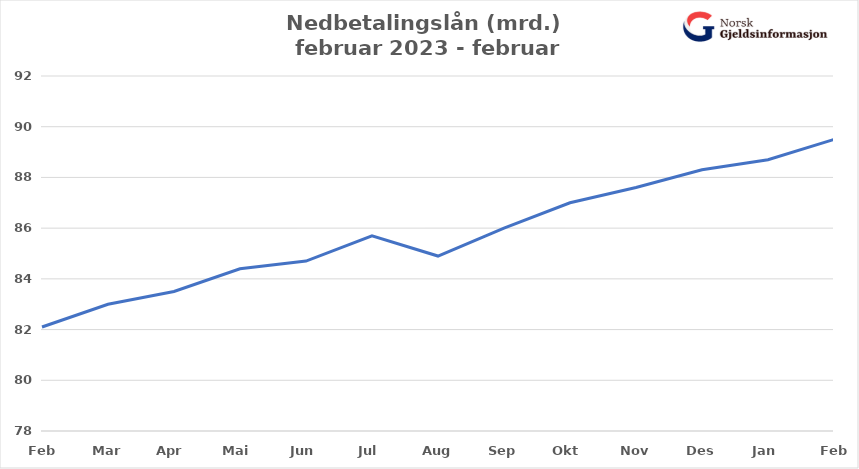
| Category | Nedbetalingslån |
|---|---|
| Feb | 82.1 |
| Mar | 83 |
| Apr | 83.5 |
| Mai | 84.4 |
| Jun | 84.7 |
| Jul | 85.7 |
| Aug | 84.9 |
| Sep | 86 |
| Okt | 87 |
| Nov | 87.6 |
| Des | 88.3 |
| Jan | 88.7 |
| Feb | 89.5 |